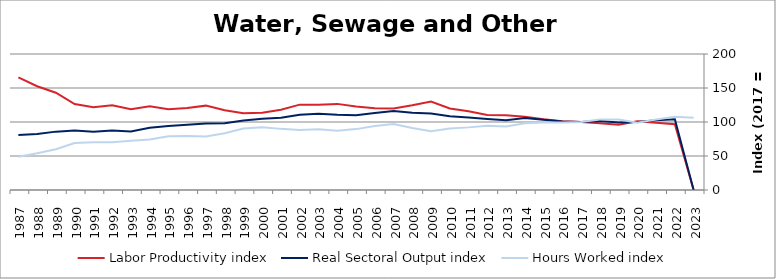
| Category | Labor Productivity index | Real Sectoral Output index | Hours Worked index |
|---|---|---|---|
| 2023.0 | 0 | 0 | 106.183 |
| 2022.0 | 96.724 | 104.056 | 107.581 |
| 2021.0 | 98.96 | 102.738 | 103.817 |
| 2020.0 | 100.972 | 100.049 | 99.086 |
| 2019.0 | 96.014 | 99.421 | 103.548 |
| 2018.0 | 97.991 | 101.415 | 103.495 |
| 2017.0 | 100 | 100 | 100 |
| 2016.0 | 101.241 | 100.588 | 99.355 |
| 2015.0 | 104.011 | 103.228 | 99.247 |
| 2014.0 | 107.873 | 105.843 | 98.118 |
| 2013.0 | 109.776 | 102.635 | 93.495 |
| 2012.0 | 110.396 | 104.283 | 94.462 |
| 2011.0 | 115.67 | 106.528 | 92.097 |
| 2010.0 | 119.896 | 108.486 | 90.484 |
| 2009.0 | 129.992 | 112.45 | 86.505 |
| 2008.0 | 124.594 | 113.474 | 91.075 |
| 2007.0 | 119.827 | 116.155 | 96.935 |
| 2006.0 | 120.118 | 113.198 | 94.239 |
| 2005.0 | 122.8 | 109.947 | 89.533 |
| 2004.0 | 126.65 | 110.537 | 87.278 |
| 2003.0 | 125.476 | 111.956 | 89.225 |
| 2002.0 | 125.509 | 110.798 | 88.279 |
| 2001.0 | 118.073 | 106.142 | 89.895 |
| 2000.0 | 113.644 | 104.826 | 92.241 |
| 1999.0 | 112.986 | 102.061 | 90.331 |
| 1998.0 | 117.352 | 98.098 | 83.593 |
| 1997.0 | 124.059 | 97.747 | 78.79 |
| 1996.0 | 120.594 | 95.878 | 79.505 |
| 1995.0 | 118.906 | 94.021 | 79.072 |
| 1994.0 | 123.107 | 91.618 | 74.421 |
| 1993.0 | 118.803 | 85.965 | 72.359 |
| 1992.0 | 124.774 | 87.528 | 70.149 |
| 1991.0 | 121.699 | 85.568 | 70.311 |
| 1990.0 | 126.44 | 87.494 | 69.198 |
| 1989.0 | 143.013 | 85.836 | 60.02 |
| 1988.0 | 152.646 | 82.489 | 54.039 |
| 1987.0 | 165.668 | 80.876 | 48.818 |